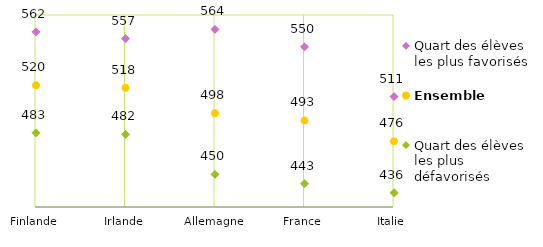
| Category | Quart des élèves les plus favorisés | Ensemble | Quart des élèves les plus défavorisés |
|---|---|---|---|
| Finlande | 561.78 | 520.079 | 482.963 |
| Irlande | 556.511 | 518.078 | 481.696 |
| Allemagne | 563.854 | 498.279 | 450.397 |
| France | 550.112 | 492.606 | 443.214 |
| Italie | 511.162 | 476.285 | 436.13 |